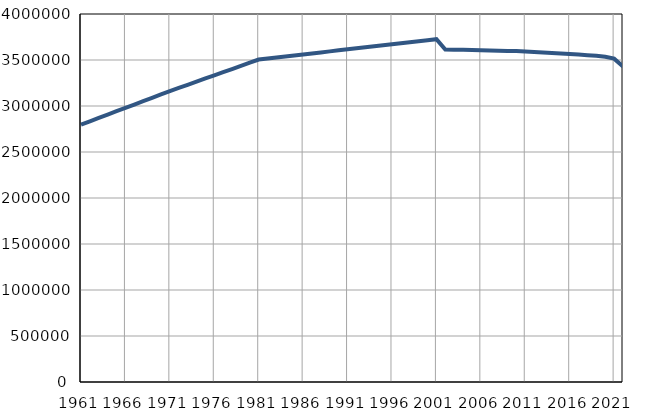
| Category | Број
становника |
|---|---|
| 1961.0 | 2797161 |
| 1962.0 | 2833637 |
| 1963.0 | 2870114 |
| 1964.0 | 2906589 |
| 1965.0 | 2943066 |
| 1966.0 | 2979541 |
| 1967.0 | 3016016 |
| 1968.0 | 3052493 |
| 1969.0 | 3088968 |
| 1970.0 | 3125444 |
| 1971.0 | 3161920 |
| 1972.0 | 3196214 |
| 1973.0 | 3230507 |
| 1974.0 | 3264801 |
| 1975.0 | 3299093 |
| 1976.0 | 3333392 |
| 1977.0 | 3367682 |
| 1978.0 | 3401975 |
| 1979.0 | 3436268 |
| 1980.0 | 3470562 |
| 1981.0 | 3504855 |
| 1982.0 | 3515981 |
| 1983.0 | 3527107 |
| 1984.0 | 3538233 |
| 1985.0 | 3549358 |
| 1986.0 | 3560487 |
| 1987.0 | 3571612 |
| 1988.0 | 3582737 |
| 1989.0 | 3593862 |
| 1990.0 | 3604989 |
| 1991.0 | 3616115 |
| 1992.0 | 3627143 |
| 1993.0 | 3638171 |
| 1994.0 | 3649198 |
| 1995.0 | 3660228 |
| 1996.0 | 3671254 |
| 1997.0 | 3682284 |
| 1998.0 | 3693310 |
| 1999.0 | 3704338 |
| 2000.0 | 3715366 |
| 2001.0 | 3726395 |
| 2002.0 | 3613215 |
| 2003.0 | 3612062 |
| 2004.0 | 3611517 |
| 2005.0 | 3609837 |
| 2006.0 | 3605459 |
| 2007.0 | 3602840 |
| 2008.0 | 3600785 |
| 2009.0 | 3598938 |
| 2010.0 | 3597090 |
| 2011.0 | 3591096 |
| 2012.0 | 3586235 |
| 2013.0 | 3581647 |
| 2014.0 | 3576978 |
| 2015.0 | 3571596 |
| 2016.0 | 3565319 |
| 2017.0 | 3558647 |
| 2018.0 | 3552056 |
| 2019.0 | 3546149 |
| 2020.0 | 3535332 |
| 2021.0 | 3514649 |
| 2022.0 | 3428249 |